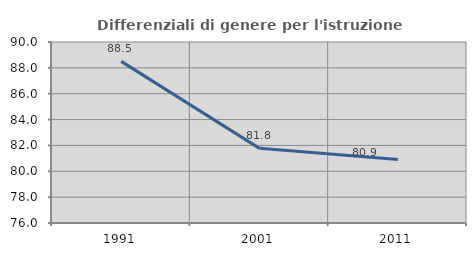
| Category | Differenziali di genere per l'istruzione superiore |
|---|---|
| 1991.0 | 88.502 |
| 2001.0 | 81.772 |
| 2011.0 | 80.914 |